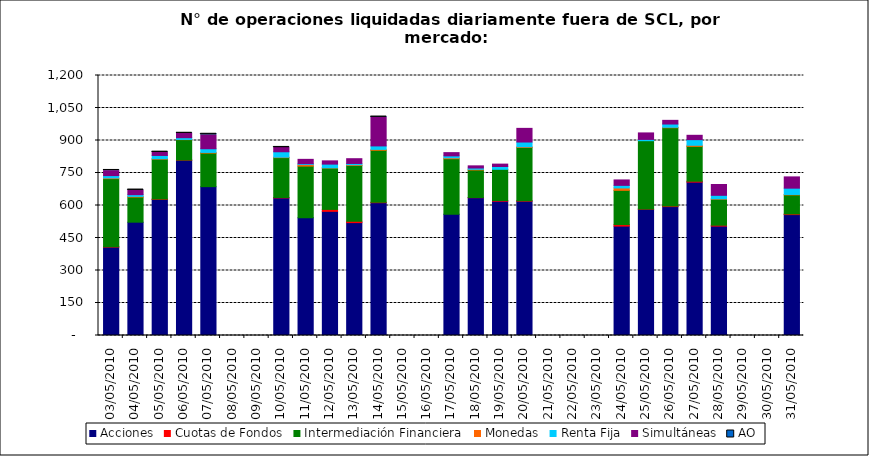
| Category | Acciones | Cuotas de Fondos | Intermediación Financiera | Monedas | Renta Fija | Simultáneas | AO |
|---|---|---|---|---|---|---|---|
| 03/05/2010 | 408 | 2 | 314 | 3 | 11 | 23 | 3 |
| 04/05/2010 | 523 | 0 | 116 | 3 | 8 | 21 | 1 |
| 05/05/2010 | 628 | 2 | 184 | 2 | 15 | 15 | 1 |
| 06/05/2010 | 809 | 1 | 94 | 1 | 8 | 20 | 2 |
| 07/05/2010 | 687 | 0 | 155 | 3 | 17 | 64 | 5 |
| 10/05/2010 | 635 | 2 | 184 | 2 | 25 | 20 | 1 |
| 11/05/2010 | 543 | 0 | 239 | 7 | 4 | 20 | 0 |
| 12/05/2010 | 573 | 9 | 191 | 1 | 17 | 15 | 0 |
| 13/05/2010 | 521 | 6 | 258 | 3 | 6 | 22 | 0 |
| 14/05/2010 | 613 | 2 | 240 | 4 | 16 | 132 | 3 |
| 17/05/2010 | 560 | 0 | 256 | 4 | 9 | 15 | 0 |
| 18/05/2010 | 636 | 1 | 127 | 3 | 6 | 10 | 0 |
| 19/05/2010 | 620 | 3 | 144 | 0 | 13 | 11 | 0 |
| 20/05/2010 | 620 | 2 | 246 | 3 | 22 | 63 | 0 |
| 24/05/2010 | 505 | 7 | 158 | 11 | 12 | 25 | 0 |
| 25/05/2010 | 583 | 1 | 315 | 0 | 6 | 30 | 0 |
| 26/05/2010 | 595 | 3 | 361 | 2 | 15 | 17 | 0 |
| 27/05/2010 | 708 | 4 | 161 | 5 | 26 | 20 | 0 |
| 28/05/2010 | 505 | 4 | 120 | 2 | 16 | 50 | 0 |
| 31/05/2010 | 558 | 3 | 88 | 2 | 29 | 52 | 0 |